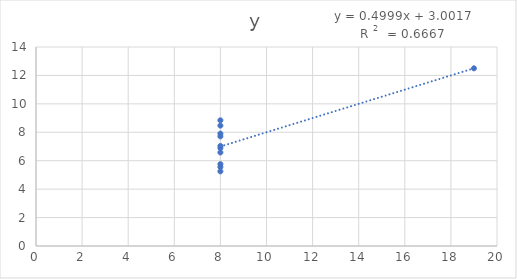
| Category | y |
|---|---|
| 8.0 | 6.58 |
| 8.0 | 5.76 |
| 8.0 | 7.71 |
| 8.0 | 8.84 |
| 8.0 | 8.47 |
| 8.0 | 7.04 |
| 8.0 | 5.25 |
| 19.0 | 12.5 |
| 8.0 | 5.56 |
| 8.0 | 7.91 |
| 8.0 | 6.89 |